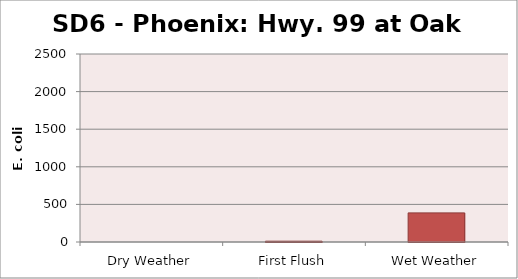
| Category | E. coli MPN |
|---|---|
| Dry Weather | 0 |
| First Flush | 10.6 |
| Wet Weather | 387.3 |